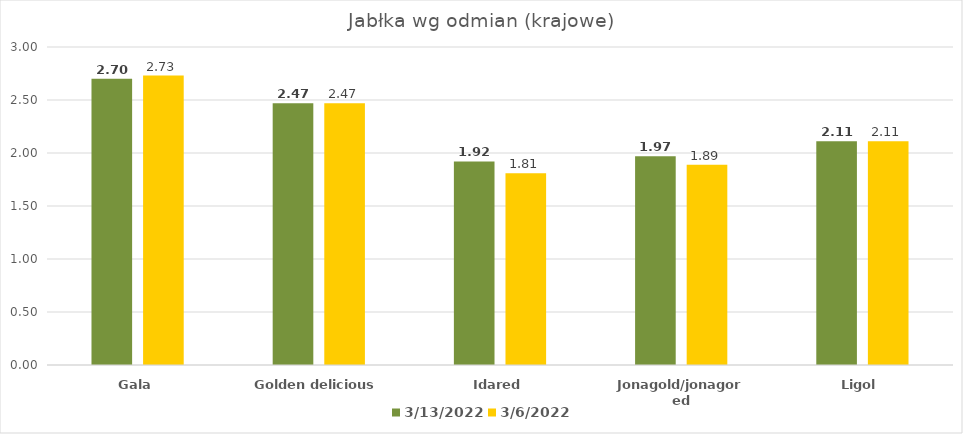
| Category | 13.03.2022 | 06.03.2022 |
|---|---|---|
| Gala | 2.7 | 2.73 |
| Golden delicious | 2.47 | 2.47 |
| Idared | 1.92 | 1.81 |
| Jonagold/jonagored | 1.97 | 1.89 |
| Ligol | 2.11 | 2.11 |